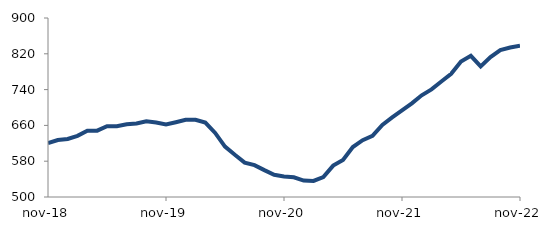
| Category | Series 0 |
|---|---|
| 2018-11-01 | 620.436 |
| 2018-12-01 | 627.396 |
| 2019-01-01 | 629.794 |
| 2019-02-01 | 636.624 |
| 2019-03-01 | 648.17 |
| 2019-04-01 | 648.206 |
| 2019-05-01 | 658.035 |
| 2019-06-01 | 657.952 |
| 2019-07-01 | 662.49 |
| 2019-08-01 | 664.104 |
| 2019-09-01 | 669.196 |
| 2019-10-01 | 666.5 |
| 2019-11-01 | 662.174 |
| 2019-12-01 | 667.143 |
| 2020-01-01 | 672.455 |
| 2020-02-01 | 672.659 |
| 2020-03-01 | 666.213 |
| 2020-04-01 | 643.145 |
| 2020-05-01 | 612.572 |
| 2020-06-01 | 594.292 |
| 2020-07-01 | 576.858 |
| 2020-08-01 | 571.224 |
| 2020-09-01 | 560.032 |
| 2020-10-01 | 549.541 |
| 2020-11-01 | 545.982 |
| 2020-12-01 | 544.038 |
| 2021-01-01 | 536.772 |
| 2021-02-01 | 535.938 |
| 2021-03-01 | 544.717 |
| 2021-04-01 | 570.16 |
| 2021-05-01 | 582.981 |
| 2021-06-01 | 611.684 |
| 2021-07-01 | 627.037 |
| 2021-08-01 | 636.642 |
| 2021-09-01 | 661.114 |
| 2021-10-01 | 677.889 |
| 2021-11-01 | 693.389 |
| 2021-12-01 | 709.343 |
| 2022-01-01 | 727.31 |
| 2022-02-01 | 740.539 |
| 2022-03-01 | 758.027 |
| 2022-04-01 | 775.241 |
| 2022-05-01 | 802.956 |
| 2022-06-01 | 815.434 |
| 2022-07-01 | 791.89 |
| 2022-08-01 | 812.76 |
| 2022-09-01 | 828.12 |
| 2022-10-01 | 834 |
| 2022-11-01 | 838.178 |